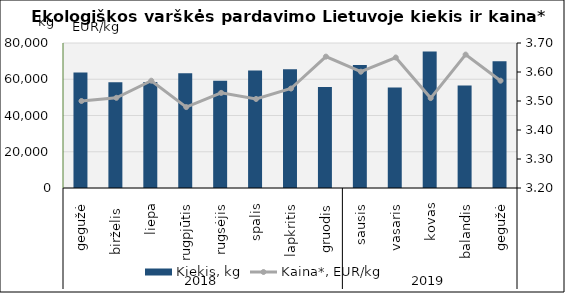
| Category | Kiekis, kg |
|---|---|
| 0 | 63790 |
| 1 | 58282 |
| 2 | 58458 |
| 3 | 63315 |
| 4 | 59137 |
| 5 | 64766 |
| 6 | 65498 |
| 7 | 55701 |
| 8 | 67880 |
| 9 | 55478 |
| 10 | 75366 |
| 11 | 56600 |
| 12 | 69884 |